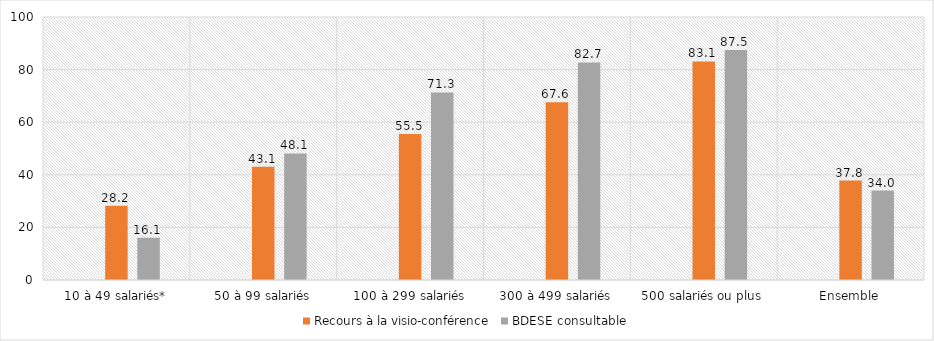
| Category | Series 0 | Recours à la visio-conférence | BDESE consultable |
|---|---|---|---|
| 10 à 49 salariés* |  | 28.2 | 16.1 |
| 50 à 99 salariés |  | 43.1 | 48.1 |
| 100 à 299 salariés |  | 55.5 | 71.3 |
| 300 à 499 salariés |  | 67.6 | 82.7 |
| 500 salariés ou plus |  | 83.1 | 87.5 |
| Ensemble |  | 37.8 | 34 |